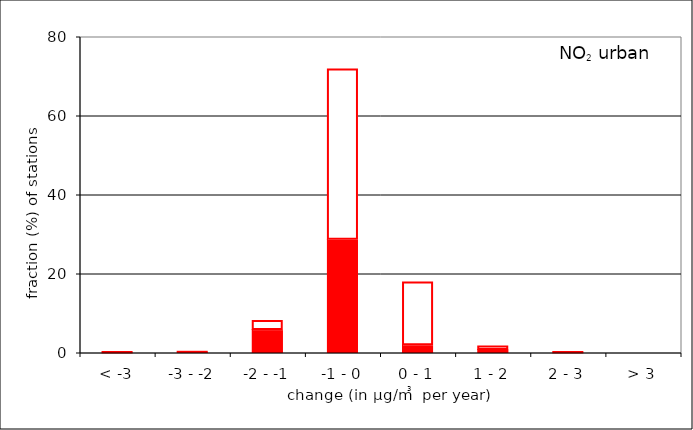
| Category | sig P>0.1 | P<0.1 |
|---|---|---|
| < -3 | 0.152 | 0 |
| -3 - -2 | 0.305 | 0 |
| -2 - -1 | 5.793 | 2.287 |
| -1 - 0 | 28.659 | 43.14 |
| 0 - 1 | 1.982 | 15.854 |
| 1 - 2 | 0.762 | 0.915 |
| 2 - 3 | 0.152 | 0 |
| > 3 | 0 | 0 |